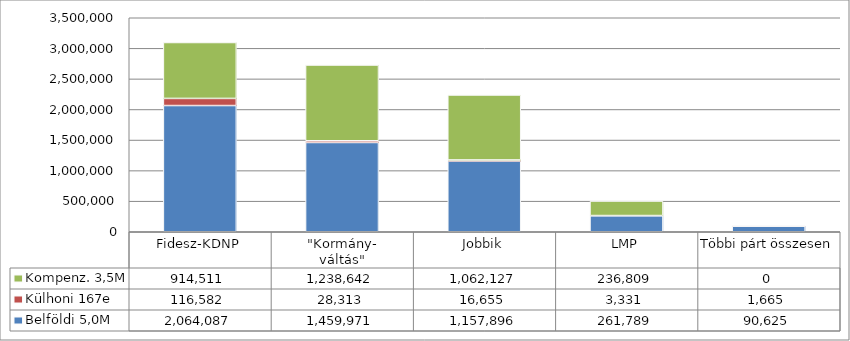
| Category | Belföldi 5,0M | Külhoni 167e | Kompenz. 3,5M |
|---|---|---|---|
| Fidesz-KDNP | 2064087 | 116582 | 914511 |
| "Kormány-
váltás" | 1459971 | 28313 | 1238642 |
| Jobbik | 1157896 | 16655 | 1062127 |
| LMP | 261789 | 3331 | 236809 |
| Többi párt összesen | 90625 | 1665 | 0 |